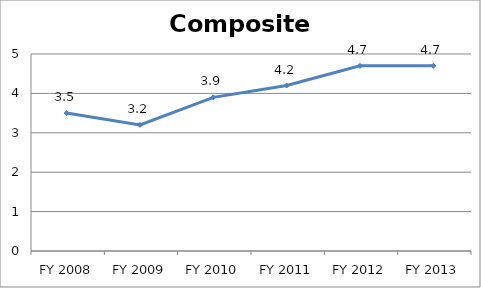
| Category | Composite score |
|---|---|
| FY 2013 | 4.7 |
| FY 2012 | 4.7 |
| FY 2011 | 4.2 |
| FY 2010 | 3.9 |
| FY 2009 | 3.2 |
| FY 2008 | 3.5 |